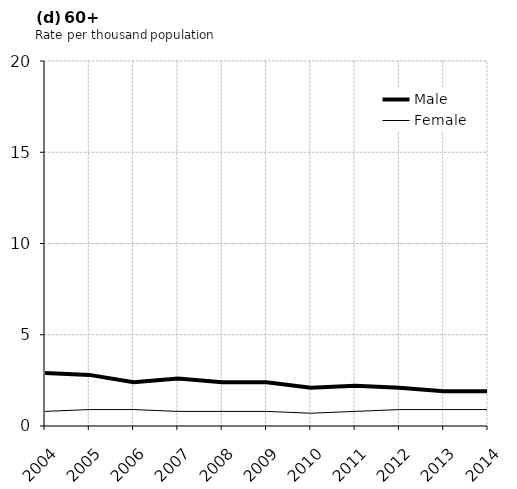
| Category | Male | Female |
|---|---|---|
| 2004.0 | 2.9 | 0.8 |
| 2005.0 | 2.8 | 0.9 |
| 2006.0 | 2.4 | 0.9 |
| 2007.0 | 2.6 | 0.8 |
| 2008.0 | 2.4 | 0.8 |
| 2009.0 | 2.4 | 0.8 |
| 2010.0 | 2.1 | 0.7 |
| 2011.0 | 2.2 | 0.8 |
| 2012.0 | 2.1 | 0.9 |
| 2013.0 | 1.9 | 0.9 |
| 2014.0 | 1.9 | 0.9 |